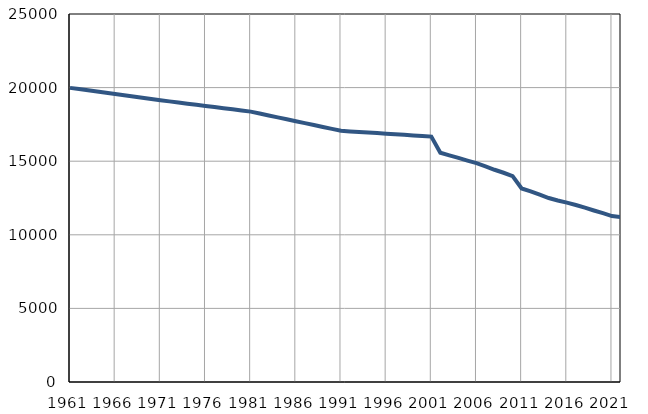
| Category | Population
size |
|---|---|
| 1961.0 | 19982 |
| 1962.0 | 19898 |
| 1963.0 | 19814 |
| 1964.0 | 19730 |
| 1965.0 | 19646 |
| 1966.0 | 19562 |
| 1967.0 | 19479 |
| 1968.0 | 19395 |
| 1969.0 | 19311 |
| 1970.0 | 19227 |
| 1971.0 | 19143 |
| 1972.0 | 19065 |
| 1973.0 | 18988 |
| 1974.0 | 18910 |
| 1975.0 | 18833 |
| 1976.0 | 18755 |
| 1977.0 | 18677 |
| 1978.0 | 18600 |
| 1979.0 | 18522 |
| 1980.0 | 18445 |
| 1981.0 | 18367 |
| 1982.0 | 18237 |
| 1983.0 | 18106 |
| 1984.0 | 17976 |
| 1985.0 | 17846 |
| 1986.0 | 17716 |
| 1987.0 | 17585 |
| 1988.0 | 17455 |
| 1989.0 | 17325 |
| 1990.0 | 17193 |
| 1991.0 | 17064 |
| 1992.0 | 17025 |
| 1993.0 | 16986 |
| 1994.0 | 16947 |
| 1995.0 | 16908 |
| 1996.0 | 16869 |
| 1997.0 | 16830 |
| 1998.0 | 16791 |
| 1999.0 | 16752 |
| 2000.0 | 16713 |
| 2001.0 | 16674 |
| 2002.0 | 15577 |
| 2003.0 | 15398 |
| 2004.0 | 15221 |
| 2005.0 | 15038 |
| 2006.0 | 14866 |
| 2007.0 | 14650 |
| 2008.0 | 14419 |
| 2009.0 | 14215 |
| 2010.0 | 13990 |
| 2011.0 | 13145 |
| 2012.0 | 12951 |
| 2013.0 | 12723 |
| 2014.0 | 12497 |
| 2015.0 | 12331 |
| 2016.0 | 12185 |
| 2017.0 | 12025 |
| 2018.0 | 11844 |
| 2019.0 | 11652 |
| 2020.0 | 11469 |
| 2021.0 | 11273 |
| 2022.0 | 11196 |